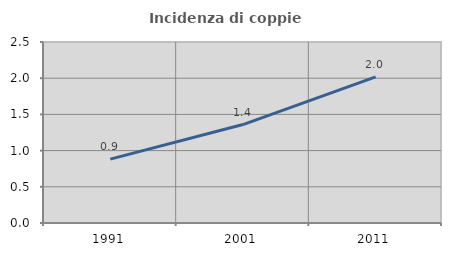
| Category | Incidenza di coppie miste |
|---|---|
| 1991.0 | 0.882 |
| 2001.0 | 1.36 |
| 2011.0 | 2.017 |